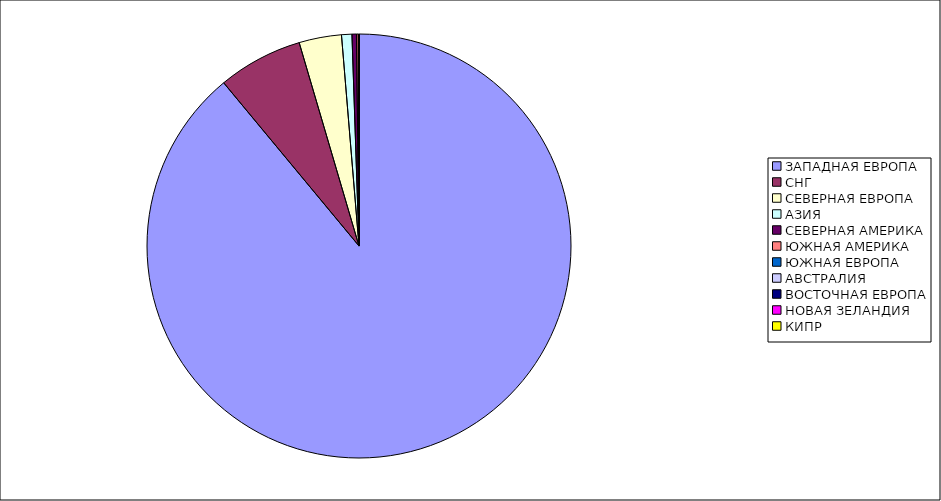
| Category | Оборот |
|---|---|
| ЗАПАДНАЯ ЕВРОПА | 0.89 |
| СНГ | 0.065 |
| СЕВЕРНАЯ ЕВРОПА | 0.032 |
| АЗИЯ | 0.008 |
| СЕВЕРНАЯ АМЕРИКА | 0.003 |
| ЮЖНАЯ АМЕРИКА | 0.001 |
| ЮЖНАЯ ЕВРОПА | 0 |
| АВСТРАЛИЯ | 0 |
| ВОСТОЧНАЯ ЕВРОПА | 0 |
| НОВАЯ ЗЕЛАНДИЯ | 0 |
| КИПР | 0 |